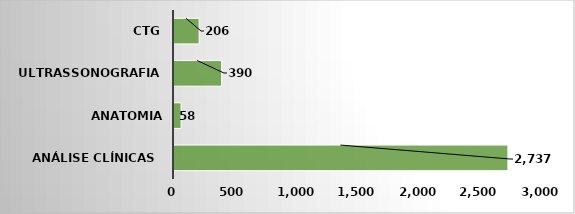
| Category | Series 0 |
|---|---|
| Análise Clínicas  | 2737 |
| Anatomia Patológica | 58 |
| Ultrassonografia  | 390 |
| CTG | 206 |